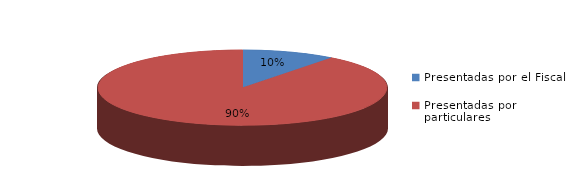
| Category | Series 0 |
|---|---|
| Presentadas por el Fiscal | 46 |
| Presentadas por particulares | 396 |